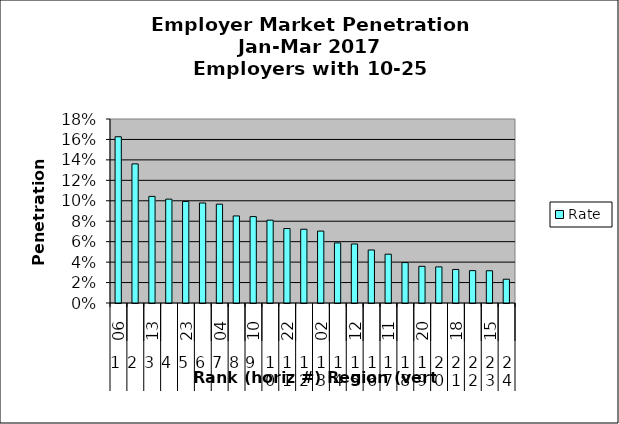
| Category | Rate |
|---|---|
| 0 | 0.163 |
| 1 | 0.136 |
| 2 | 0.104 |
| 3 | 0.102 |
| 4 | 0.099 |
| 5 | 0.098 |
| 6 | 0.097 |
| 7 | 0.085 |
| 8 | 0.084 |
| 9 | 0.081 |
| 10 | 0.073 |
| 11 | 0.072 |
| 12 | 0.07 |
| 13 | 0.059 |
| 14 | 0.058 |
| 15 | 0.052 |
| 16 | 0.048 |
| 17 | 0.04 |
| 18 | 0.036 |
| 19 | 0.035 |
| 20 | 0.033 |
| 21 | 0.032 |
| 22 | 0.032 |
| 23 | 0.023 |